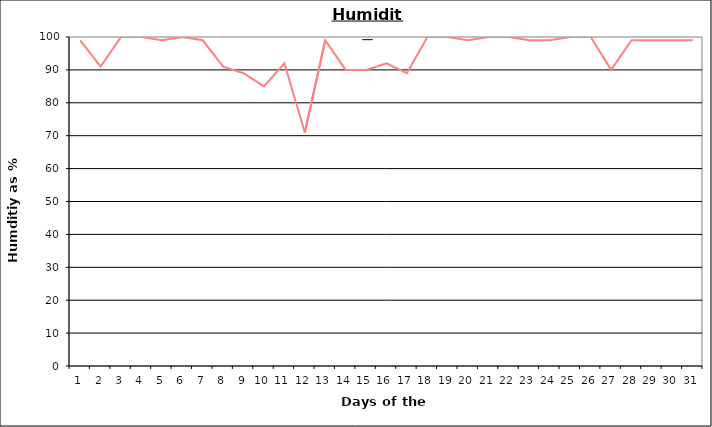
| Category | Series 0 |
|---|---|
| 0 | 99 |
| 1 | 91 |
| 2 | 100 |
| 3 | 100 |
| 4 | 99 |
| 5 | 100 |
| 6 | 99 |
| 7 | 91 |
| 8 | 89 |
| 9 | 85 |
| 10 | 92 |
| 11 | 71 |
| 12 | 99 |
| 13 | 90 |
| 14 | 90 |
| 15 | 92 |
| 16 | 89 |
| 17 | 100 |
| 18 | 100 |
| 19 | 99 |
| 20 | 100 |
| 21 | 100 |
| 22 | 99 |
| 23 | 99 |
| 24 | 100 |
| 25 | 100 |
| 26 | 90 |
| 27 | 99 |
| 28 | 99 |
| 29 | 99 |
| 30 | 99 |